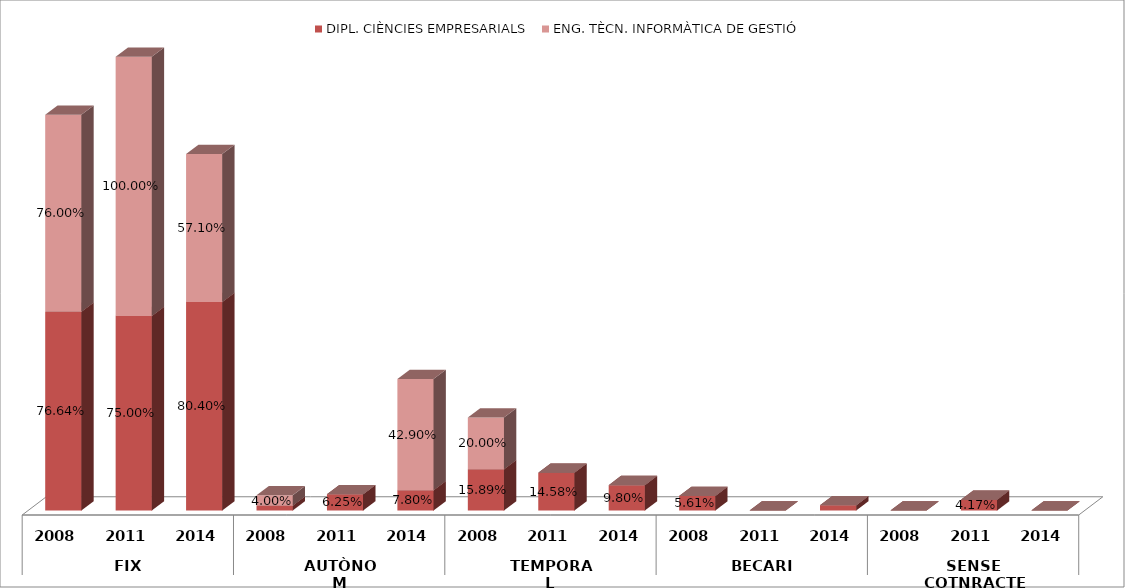
| Category | DIPL. CIÈNCIES EMPRESARIALS | ENG. TÈCN. INFORMÀTICA DE GESTIÓ |
|---|---|---|
| 0 | 0.766 | 0.76 |
| 1 | 0.75 | 1 |
| 2 | 0.804 | 0.571 |
| 3 | 0.019 | 0.04 |
| 4 | 0.062 | 0 |
| 5 | 0.078 | 0.429 |
| 6 | 0.159 | 0.2 |
| 7 | 0.146 | 0 |
| 8 | 0.098 | 0 |
| 9 | 0.056 | 0 |
| 10 | 0 | 0 |
| 11 | 0.02 | 0 |
| 12 | 0 | 0 |
| 13 | 0.042 | 0 |
| 14 | 0 | 0 |